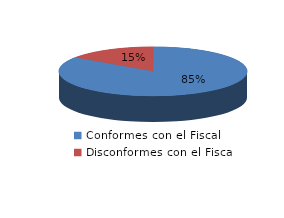
| Category | Series 0 |
|---|---|
| 0 | 33 |
| 1 | 6 |